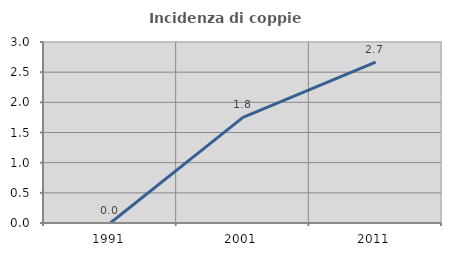
| Category | Incidenza di coppie miste |
|---|---|
| 1991.0 | 0 |
| 2001.0 | 1.751 |
| 2011.0 | 2.667 |